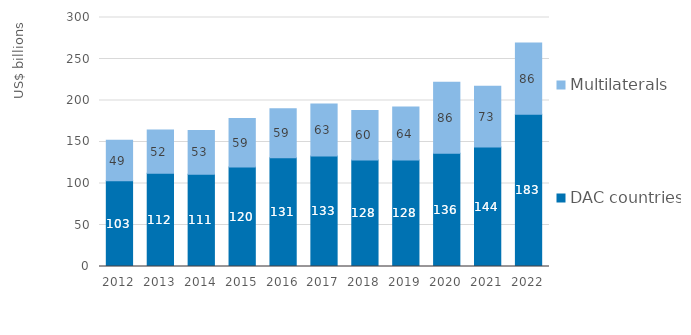
| Category | DAC countries | Multilaterals |
|---|---|---|
| 2012.0 | 103.29 | 48.717 |
| 2013.0 | 112.368 | 52.206 |
| 2014.0 | 111.099 | 52.654 |
| 2015.0 | 119.875 | 58.558 |
| 2016.0 | 130.924 | 59.14 |
| 2017.0 | 133.197 | 62.568 |
| 2018.0 | 128.185 | 59.838 |
| 2019.0 | 128.232 | 63.88 |
| 2020.0 | 136.348 | 85.568 |
| 2021.0 | 143.989 | 73.328 |
| 2022.0 | 183.302 | 86.084 |